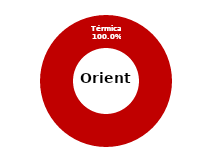
| Category | Oriente |
|---|---|
| Eólica | 0 |
| Hidráulica | 0 |
| Solar | 0 |
| Térmica | 35.45 |